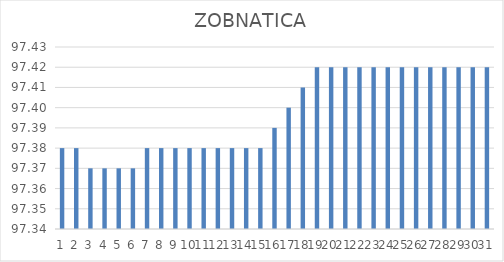
| Category | ZOBNATICA |
|---|---|
| 0 | 97.38 |
| 1 | 97.38 |
| 2 | 97.37 |
| 3 | 97.37 |
| 4 | 97.37 |
| 5 | 97.37 |
| 6 | 97.38 |
| 7 | 97.38 |
| 8 | 97.38 |
| 9 | 97.38 |
| 10 | 97.38 |
| 11 | 97.38 |
| 12 | 97.38 |
| 13 | 97.38 |
| 14 | 97.38 |
| 15 | 97.39 |
| 16 | 97.4 |
| 17 | 97.41 |
| 18 | 97.42 |
| 19 | 97.42 |
| 20 | 97.42 |
| 21 | 97.42 |
| 22 | 97.42 |
| 23 | 97.42 |
| 24 | 97.42 |
| 25 | 97.42 |
| 26 | 97.42 |
| 27 | 97.42 |
| 28 | 97.42 |
| 29 | 97.42 |
| 30 | 97.42 |